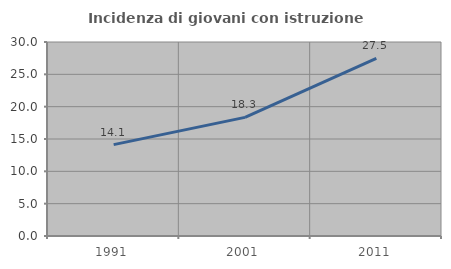
| Category | Incidenza di giovani con istruzione universitaria |
|---|---|
| 1991.0 | 14.129 |
| 2001.0 | 18.345 |
| 2011.0 | 27.459 |